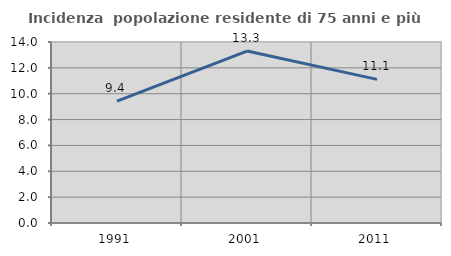
| Category | Incidenza  popolazione residente di 75 anni e più |
|---|---|
| 1991.0 | 9.421 |
| 2001.0 | 13.3 |
| 2011.0 | 11.111 |